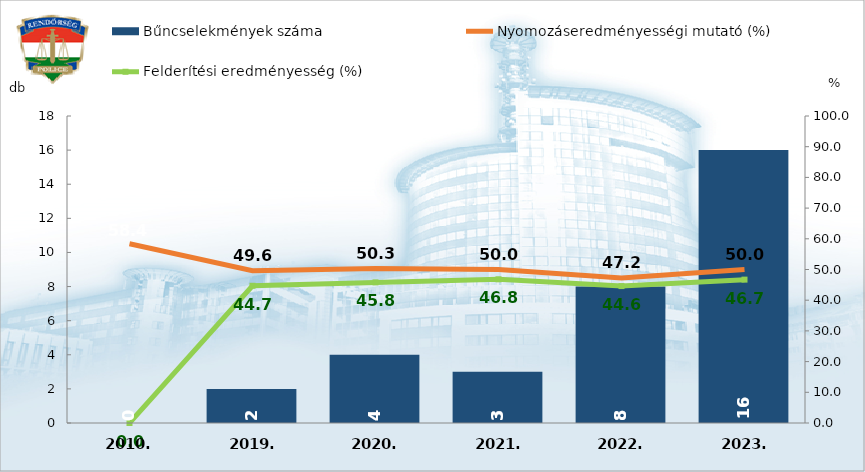
| Category | Bűncselekmények száma |
|---|---|
| 2010. | 0 |
| 2019. | 2 |
| 2020. | 4 |
| 2021. | 3 |
| 2022. | 8 |
| 2023. | 16 |